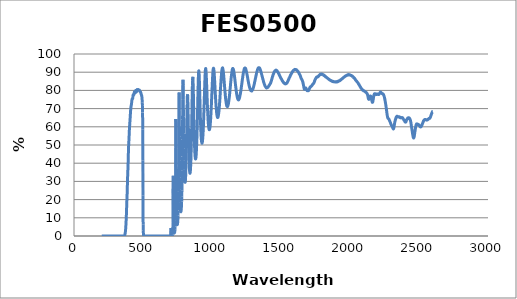
| Category | Series 0 |
|---|---|
| 2600.0 | 68.499 |
| 2599.0 | 68.486 |
| 2598.0 | 68.389 |
| 2597.0 | 68.255 |
| 2596.0 | 68.071 |
| 2595.0 | 67.856 |
| 2594.0 | 67.703 |
| 2593.0 | 67.489 |
| 2592.0 | 67.218 |
| 2591.0 | 67.138 |
| 2590.0 | 66.969 |
| 2589.0 | 66.724 |
| 2588.0 | 66.504 |
| 2587.0 | 66.284 |
| 2586.0 | 66.034 |
| 2585.0 | 65.827 |
| 2584.0 | 65.613 |
| 2583.0 | 65.387 |
| 2582.0 | 65.178 |
| 2581.0 | 65.131 |
| 2580.0 | 64.953 |
| 2579.0 | 64.79 |
| 2578.0 | 64.734 |
| 2577.0 | 64.654 |
| 2576.0 | 64.761 |
| 2575.0 | 64.619 |
| 2574.0 | 64.648 |
| 2573.0 | 64.544 |
| 2572.0 | 64.473 |
| 2571.0 | 64.456 |
| 2570.0 | 64.378 |
| 2569.0 | 64.387 |
| 2568.0 | 64.315 |
| 2567.0 | 64.325 |
| 2566.0 | 64.165 |
| 2565.0 | 64.015 |
| 2564.0 | 64.051 |
| 2563.0 | 63.974 |
| 2562.0 | 64.001 |
| 2561.0 | 63.814 |
| 2560.0 | 63.844 |
| 2559.0 | 63.832 |
| 2558.0 | 63.679 |
| 2557.0 | 63.781 |
| 2556.0 | 63.698 |
| 2555.0 | 63.745 |
| 2554.0 | 63.726 |
| 2553.0 | 63.829 |
| 2552.0 | 63.738 |
| 2551.0 | 63.839 |
| 2550.0 | 63.887 |
| 2549.0 | 63.909 |
| 2548.0 | 63.908 |
| 2547.0 | 63.933 |
| 2546.0 | 64.01 |
| 2545.0 | 63.968 |
| 2544.0 | 63.911 |
| 2543.0 | 63.993 |
| 2542.0 | 64.005 |
| 2541.0 | 63.936 |
| 2540.0 | 63.906 |
| 2539.0 | 63.852 |
| 2538.0 | 63.786 |
| 2537.0 | 63.677 |
| 2536.0 | 63.669 |
| 2535.0 | 63.457 |
| 2534.0 | 63.336 |
| 2533.0 | 63.187 |
| 2532.0 | 63.136 |
| 2531.0 | 62.85 |
| 2530.0 | 62.669 |
| 2529.0 | 62.463 |
| 2528.0 | 62.302 |
| 2527.0 | 62.128 |
| 2526.0 | 61.932 |
| 2525.0 | 61.717 |
| 2524.0 | 61.502 |
| 2523.0 | 61.374 |
| 2522.0 | 61.182 |
| 2521.0 | 60.892 |
| 2520.0 | 60.77 |
| 2519.0 | 60.688 |
| 2518.0 | 60.524 |
| 2517.0 | 60.266 |
| 2516.0 | 60.193 |
| 2515.0 | 60.096 |
| 2514.0 | 60.039 |
| 2513.0 | 59.946 |
| 2512.0 | 59.954 |
| 2511.0 | 59.932 |
| 2510.0 | 60.005 |
| 2509.0 | 60.042 |
| 2508.0 | 60.108 |
| 2507.0 | 60.172 |
| 2506.0 | 60.238 |
| 2505.0 | 60.357 |
| 2504.0 | 60.441 |
| 2503.0 | 60.53 |
| 2502.0 | 60.752 |
| 2501.0 | 60.722 |
| 2500.0 | 60.884 |
| 2499.0 | 61.047 |
| 2498.0 | 61.03 |
| 2497.0 | 61.134 |
| 2496.0 | 61.274 |
| 2495.0 | 61.306 |
| 2494.0 | 61.327 |
| 2493.0 | 61.361 |
| 2492.0 | 61.408 |
| 2491.0 | 61.386 |
| 2490.0 | 61.442 |
| 2489.0 | 61.438 |
| 2488.0 | 61.518 |
| 2487.0 | 61.565 |
| 2486.0 | 61.558 |
| 2485.0 | 61.612 |
| 2484.0 | 61.506 |
| 2483.0 | 61.581 |
| 2482.0 | 61.523 |
| 2481.0 | 61.346 |
| 2480.0 | 61.155 |
| 2479.0 | 60.99 |
| 2478.0 | 60.609 |
| 2477.0 | 60.35 |
| 2476.0 | 60.003 |
| 2475.0 | 59.605 |
| 2474.0 | 59.11 |
| 2473.0 | 58.639 |
| 2472.0 | 58.097 |
| 2471.0 | 57.627 |
| 2470.0 | 57.162 |
| 2469.0 | 56.637 |
| 2468.0 | 56.035 |
| 2467.0 | 55.505 |
| 2466.0 | 55.067 |
| 2465.0 | 54.567 |
| 2464.0 | 54.275 |
| 2463.0 | 54.07 |
| 2462.0 | 53.96 |
| 2461.0 | 53.79 |
| 2460.0 | 53.982 |
| 2459.0 | 54.095 |
| 2458.0 | 54.323 |
| 2457.0 | 54.785 |
| 2456.0 | 55.182 |
| 2455.0 | 55.616 |
| 2454.0 | 55.963 |
| 2453.0 | 56.507 |
| 2452.0 | 56.924 |
| 2451.0 | 57.466 |
| 2450.0 | 57.919 |
| 2449.0 | 58.414 |
| 2448.0 | 58.925 |
| 2447.0 | 59.394 |
| 2446.0 | 59.949 |
| 2445.0 | 60.416 |
| 2444.0 | 61.032 |
| 2443.0 | 61.467 |
| 2442.0 | 61.95 |
| 2441.0 | 62.509 |
| 2440.0 | 62.75 |
| 2439.0 | 63.087 |
| 2438.0 | 63.503 |
| 2437.0 | 63.759 |
| 2436.0 | 63.857 |
| 2435.0 | 64.092 |
| 2434.0 | 64.332 |
| 2433.0 | 64.366 |
| 2432.0 | 64.584 |
| 2431.0 | 64.708 |
| 2430.0 | 64.746 |
| 2429.0 | 64.807 |
| 2428.0 | 64.839 |
| 2427.0 | 64.867 |
| 2426.0 | 64.988 |
| 2425.0 | 64.92 |
| 2424.0 | 64.914 |
| 2423.0 | 64.905 |
| 2422.0 | 64.936 |
| 2421.0 | 64.886 |
| 2420.0 | 64.807 |
| 2419.0 | 64.829 |
| 2418.0 | 64.733 |
| 2417.0 | 64.608 |
| 2416.0 | 64.532 |
| 2415.0 | 64.46 |
| 2414.0 | 64.219 |
| 2413.0 | 64.221 |
| 2412.0 | 64.067 |
| 2411.0 | 63.83 |
| 2410.0 | 63.697 |
| 2409.0 | 63.561 |
| 2408.0 | 63.275 |
| 2407.0 | 63.106 |
| 2406.0 | 62.95 |
| 2405.0 | 62.686 |
| 2404.0 | 62.591 |
| 2403.0 | 62.632 |
| 2402.0 | 62.535 |
| 2401.0 | 62.614 |
| 2400.0 | 62.68 |
| 2399.0 | 62.671 |
| 2398.0 | 62.782 |
| 2397.0 | 62.964 |
| 2396.0 | 63.082 |
| 2395.0 | 63.202 |
| 2394.0 | 63.341 |
| 2393.0 | 63.485 |
| 2392.0 | 63.596 |
| 2391.0 | 63.778 |
| 2390.0 | 63.89 |
| 2389.0 | 63.929 |
| 2388.0 | 64.107 |
| 2387.0 | 64.193 |
| 2386.0 | 64.318 |
| 2385.0 | 64.485 |
| 2384.0 | 64.606 |
| 2383.0 | 64.669 |
| 2382.0 | 64.846 |
| 2381.0 | 64.924 |
| 2380.0 | 64.988 |
| 2379.0 | 65.081 |
| 2378.0 | 65.055 |
| 2377.0 | 65.072 |
| 2376.0 | 65.12 |
| 2375.0 | 65.001 |
| 2374.0 | 64.998 |
| 2373.0 | 65.071 |
| 2372.0 | 65 |
| 2371.0 | 65.001 |
| 2370.0 | 64.878 |
| 2369.0 | 65.002 |
| 2368.0 | 64.956 |
| 2367.0 | 64.913 |
| 2366.0 | 64.986 |
| 2365.0 | 64.933 |
| 2364.0 | 65.103 |
| 2363.0 | 65.094 |
| 2362.0 | 65.146 |
| 2361.0 | 65.318 |
| 2360.0 | 65.36 |
| 2359.0 | 65.426 |
| 2358.0 | 65.432 |
| 2357.0 | 65.517 |
| 2356.0 | 65.537 |
| 2355.0 | 65.526 |
| 2354.0 | 65.425 |
| 2353.0 | 65.49 |
| 2352.0 | 65.42 |
| 2351.0 | 65.335 |
| 2350.0 | 65.427 |
| 2349.0 | 65.487 |
| 2348.0 | 65.428 |
| 2347.0 | 65.553 |
| 2346.0 | 65.524 |
| 2345.0 | 65.612 |
| 2344.0 | 65.661 |
| 2343.0 | 65.72 |
| 2342.0 | 65.731 |
| 2341.0 | 65.836 |
| 2340.0 | 65.79 |
| 2339.0 | 65.692 |
| 2338.0 | 65.629 |
| 2337.0 | 65.575 |
| 2336.0 | 65.455 |
| 2335.0 | 65.29 |
| 2334.0 | 65.168 |
| 2333.0 | 64.843 |
| 2332.0 | 64.634 |
| 2331.0 | 64.416 |
| 2330.0 | 64.099 |
| 2329.0 | 63.827 |
| 2328.0 | 63.649 |
| 2327.0 | 63.3 |
| 2326.0 | 62.936 |
| 2325.0 | 62.686 |
| 2324.0 | 62.281 |
| 2323.0 | 61.818 |
| 2322.0 | 61.443 |
| 2321.0 | 60.929 |
| 2320.0 | 60.406 |
| 2319.0 | 59.988 |
| 2318.0 | 59.506 |
| 2317.0 | 59.191 |
| 2316.0 | 58.978 |
| 2315.0 | 58.849 |
| 2314.0 | 58.801 |
| 2313.0 | 58.95 |
| 2312.0 | 58.981 |
| 2311.0 | 59.197 |
| 2310.0 | 59.374 |
| 2309.0 | 59.648 |
| 2308.0 | 59.865 |
| 2307.0 | 60.021 |
| 2306.0 | 60.198 |
| 2305.0 | 60.302 |
| 2304.0 | 60.451 |
| 2303.0 | 60.477 |
| 2302.0 | 60.641 |
| 2301.0 | 60.79 |
| 2300.0 | 60.906 |
| 2299.0 | 61.033 |
| 2298.0 | 61.269 |
| 2297.0 | 61.377 |
| 2296.0 | 61.622 |
| 2295.0 | 61.84 |
| 2294.0 | 62 |
| 2293.0 | 62.246 |
| 2292.0 | 62.453 |
| 2291.0 | 62.595 |
| 2290.0 | 62.759 |
| 2289.0 | 62.949 |
| 2288.0 | 63.08 |
| 2287.0 | 63.289 |
| 2286.0 | 63.512 |
| 2285.0 | 63.736 |
| 2284.0 | 63.864 |
| 2283.0 | 64.007 |
| 2282.0 | 64.172 |
| 2281.0 | 64.281 |
| 2280.0 | 64.384 |
| 2279.0 | 64.405 |
| 2278.0 | 64.538 |
| 2277.0 | 64.623 |
| 2276.0 | 64.613 |
| 2275.0 | 64.66 |
| 2274.0 | 64.968 |
| 2273.0 | 65.053 |
| 2272.0 | 65.417 |
| 2271.0 | 65.8 |
| 2270.0 | 66.258 |
| 2269.0 | 66.739 |
| 2268.0 | 67.259 |
| 2267.0 | 67.808 |
| 2266.0 | 68.33 |
| 2265.0 | 68.99 |
| 2264.0 | 69.536 |
| 2263.0 | 70.117 |
| 2262.0 | 70.641 |
| 2261.0 | 71.212 |
| 2260.0 | 71.718 |
| 2259.0 | 72.141 |
| 2258.0 | 72.752 |
| 2257.0 | 73.169 |
| 2256.0 | 73.657 |
| 2255.0 | 74.114 |
| 2254.0 | 74.479 |
| 2253.0 | 74.943 |
| 2252.0 | 75.249 |
| 2251.0 | 75.713 |
| 2250.0 | 75.918 |
| 2249.0 | 76.366 |
| 2248.0 | 76.545 |
| 2247.0 | 76.828 |
| 2246.0 | 77.145 |
| 2245.0 | 77.224 |
| 2244.0 | 77.434 |
| 2243.0 | 77.637 |
| 2242.0 | 77.865 |
| 2241.0 | 77.871 |
| 2240.0 | 77.936 |
| 2239.0 | 77.99 |
| 2238.0 | 78.101 |
| 2237.0 | 78.094 |
| 2236.0 | 78.171 |
| 2235.0 | 78.203 |
| 2234.0 | 78.278 |
| 2233.0 | 78.155 |
| 2232.0 | 78.292 |
| 2231.0 | 78.332 |
| 2230.0 | 78.45 |
| 2229.0 | 78.527 |
| 2228.0 | 78.625 |
| 2227.0 | 78.685 |
| 2226.0 | 78.754 |
| 2225.0 | 78.872 |
| 2224.0 | 78.933 |
| 2223.0 | 78.97 |
| 2222.0 | 79.001 |
| 2221.0 | 79.087 |
| 2220.0 | 78.958 |
| 2219.0 | 78.887 |
| 2218.0 | 78.879 |
| 2217.0 | 78.741 |
| 2216.0 | 78.659 |
| 2215.0 | 78.408 |
| 2214.0 | 78.302 |
| 2213.0 | 78.233 |
| 2212.0 | 78.029 |
| 2211.0 | 77.981 |
| 2210.0 | 77.8 |
| 2209.0 | 77.751 |
| 2208.0 | 77.721 |
| 2207.0 | 77.808 |
| 2206.0 | 77.811 |
| 2205.0 | 77.795 |
| 2204.0 | 77.75 |
| 2203.0 | 77.921 |
| 2202.0 | 77.981 |
| 2201.0 | 77.975 |
| 2200.0 | 78.064 |
| 2199.0 | 77.979 |
| 2198.0 | 78.065 |
| 2197.0 | 78.022 |
| 2196.0 | 77.966 |
| 2195.0 | 78.016 |
| 2194.0 | 77.964 |
| 2193.0 | 77.857 |
| 2192.0 | 77.826 |
| 2191.0 | 77.786 |
| 2190.0 | 77.719 |
| 2189.0 | 77.867 |
| 2188.0 | 77.845 |
| 2187.0 | 77.862 |
| 2186.0 | 78.015 |
| 2185.0 | 78.001 |
| 2184.0 | 77.99 |
| 2183.0 | 78.099 |
| 2182.0 | 78.197 |
| 2181.0 | 78.215 |
| 2180.0 | 78.146 |
| 2179.0 | 78.164 |
| 2178.0 | 78.15 |
| 2177.0 | 78.104 |
| 2176.0 | 77.845 |
| 2175.0 | 77.729 |
| 2174.0 | 77.52 |
| 2173.0 | 77.203 |
| 2172.0 | 76.77 |
| 2171.0 | 76.459 |
| 2170.0 | 75.863 |
| 2169.0 | 75.419 |
| 2168.0 | 74.959 |
| 2167.0 | 74.509 |
| 2166.0 | 74.042 |
| 2165.0 | 73.678 |
| 2164.0 | 73.518 |
| 2163.0 | 73.428 |
| 2162.0 | 73.449 |
| 2161.0 | 73.661 |
| 2160.0 | 73.842 |
| 2159.0 | 74.201 |
| 2158.0 | 74.526 |
| 2157.0 | 74.949 |
| 2156.0 | 75.223 |
| 2155.0 | 75.62 |
| 2154.0 | 76.009 |
| 2153.0 | 76.203 |
| 2152.0 | 76.481 |
| 2151.0 | 76.665 |
| 2150.0 | 76.768 |
| 2149.0 | 76.872 |
| 2148.0 | 76.906 |
| 2147.0 | 76.896 |
| 2146.0 | 76.887 |
| 2145.0 | 76.612 |
| 2144.0 | 76.471 |
| 2143.0 | 76.249 |
| 2142.0 | 76.081 |
| 2141.0 | 75.865 |
| 2140.0 | 75.581 |
| 2139.0 | 75.352 |
| 2138.0 | 75.185 |
| 2137.0 | 75.194 |
| 2136.0 | 75.076 |
| 2135.0 | 75.238 |
| 2134.0 | 75.377 |
| 2133.0 | 75.596 |
| 2132.0 | 76.024 |
| 2131.0 | 76.299 |
| 2130.0 | 76.735 |
| 2129.0 | 77.123 |
| 2128.0 | 77.291 |
| 2127.0 | 77.697 |
| 2126.0 | 77.883 |
| 2125.0 | 78.067 |
| 2124.0 | 78.173 |
| 2123.0 | 78.398 |
| 2122.0 | 78.424 |
| 2121.0 | 78.486 |
| 2120.0 | 78.607 |
| 2119.0 | 78.749 |
| 2118.0 | 78.819 |
| 2117.0 | 78.901 |
| 2116.0 | 78.968 |
| 2115.0 | 79.018 |
| 2114.0 | 79.053 |
| 2113.0 | 79.085 |
| 2112.0 | 79.17 |
| 2111.0 | 79.208 |
| 2110.0 | 79.319 |
| 2109.0 | 79.401 |
| 2108.0 | 79.382 |
| 2107.0 | 79.514 |
| 2106.0 | 79.558 |
| 2105.0 | 79.55 |
| 2104.0 | 79.632 |
| 2103.0 | 79.616 |
| 2102.0 | 79.701 |
| 2101.0 | 79.744 |
| 2100.0 | 79.871 |
| 2099.0 | 79.764 |
| 2098.0 | 79.837 |
| 2097.0 | 80.002 |
| 2096.0 | 79.931 |
| 2095.0 | 80 |
| 2094.0 | 80.059 |
| 2093.0 | 80.199 |
| 2092.0 | 80.136 |
| 2091.0 | 80.325 |
| 2090.0 | 80.376 |
| 2089.0 | 80.421 |
| 2088.0 | 80.487 |
| 2087.0 | 80.531 |
| 2086.0 | 80.74 |
| 2085.0 | 80.734 |
| 2084.0 | 80.861 |
| 2083.0 | 80.96 |
| 2082.0 | 81.11 |
| 2081.0 | 81.253 |
| 2080.0 | 81.227 |
| 2079.0 | 81.361 |
| 2078.0 | 81.506 |
| 2077.0 | 81.63 |
| 2076.0 | 81.861 |
| 2075.0 | 81.947 |
| 2074.0 | 81.991 |
| 2073.0 | 82.126 |
| 2072.0 | 82.359 |
| 2071.0 | 82.412 |
| 2070.0 | 82.499 |
| 2069.0 | 82.766 |
| 2068.0 | 82.825 |
| 2067.0 | 82.918 |
| 2066.0 | 83.188 |
| 2065.0 | 83.288 |
| 2064.0 | 83.342 |
| 2063.0 | 83.416 |
| 2062.0 | 83.507 |
| 2061.0 | 83.678 |
| 2060.0 | 83.756 |
| 2059.0 | 83.953 |
| 2058.0 | 84.027 |
| 2057.0 | 84.123 |
| 2056.0 | 84.269 |
| 2055.0 | 84.377 |
| 2054.0 | 84.437 |
| 2053.0 | 84.6 |
| 2052.0 | 84.675 |
| 2051.0 | 84.725 |
| 2050.0 | 84.773 |
| 2049.0 | 84.967 |
| 2048.0 | 85.051 |
| 2047.0 | 85.184 |
| 2046.0 | 85.173 |
| 2045.0 | 85.399 |
| 2044.0 | 85.469 |
| 2043.0 | 85.546 |
| 2042.0 | 85.581 |
| 2041.0 | 85.627 |
| 2040.0 | 85.796 |
| 2039.0 | 85.93 |
| 2038.0 | 86.031 |
| 2037.0 | 86.18 |
| 2036.0 | 86.325 |
| 2035.0 | 86.418 |
| 2034.0 | 86.527 |
| 2033.0 | 86.597 |
| 2032.0 | 86.641 |
| 2031.0 | 86.68 |
| 2030.0 | 86.831 |
| 2029.0 | 86.793 |
| 2028.0 | 86.947 |
| 2027.0 | 87.042 |
| 2026.0 | 87.103 |
| 2025.0 | 87.082 |
| 2024.0 | 87.33 |
| 2023.0 | 87.355 |
| 2022.0 | 87.466 |
| 2021.0 | 87.574 |
| 2020.0 | 87.531 |
| 2019.0 | 87.707 |
| 2018.0 | 87.571 |
| 2017.0 | 87.824 |
| 2016.0 | 87.842 |
| 2015.0 | 87.914 |
| 2014.0 | 87.969 |
| 2013.0 | 87.988 |
| 2012.0 | 88.143 |
| 2011.0 | 88.121 |
| 2010.0 | 88.107 |
| 2009.0 | 88.219 |
| 2008.0 | 88.158 |
| 2007.0 | 88.229 |
| 2006.0 | 88.255 |
| 2005.0 | 88.321 |
| 2004.0 | 88.393 |
| 2003.0 | 88.404 |
| 2002.0 | 88.457 |
| 2001.0 | 88.508 |
| 2000.0 | 88.506 |
| 1999.0 | 88.473 |
| 1998.0 | 88.559 |
| 1997.0 | 88.444 |
| 1996.0 | 88.567 |
| 1995.0 | 88.502 |
| 1994.0 | 88.545 |
| 1993.0 | 88.519 |
| 1992.0 | 88.612 |
| 1991.0 | 88.736 |
| 1990.0 | 88.624 |
| 1989.0 | 88.485 |
| 1988.0 | 88.548 |
| 1987.0 | 88.538 |
| 1986.0 | 88.547 |
| 1985.0 | 88.558 |
| 1984.0 | 88.455 |
| 1983.0 | 88.488 |
| 1982.0 | 88.566 |
| 1981.0 | 88.439 |
| 1980.0 | 88.42 |
| 1979.0 | 88.308 |
| 1978.0 | 88.323 |
| 1977.0 | 88.265 |
| 1976.0 | 88.301 |
| 1975.0 | 88.25 |
| 1974.0 | 88.24 |
| 1973.0 | 88.097 |
| 1972.0 | 88.049 |
| 1971.0 | 88.018 |
| 1970.0 | 88.052 |
| 1969.0 | 88.032 |
| 1968.0 | 87.953 |
| 1967.0 | 87.81 |
| 1966.0 | 87.768 |
| 1965.0 | 87.748 |
| 1964.0 | 87.743 |
| 1963.0 | 87.646 |
| 1962.0 | 87.598 |
| 1961.0 | 87.565 |
| 1960.0 | 87.509 |
| 1959.0 | 87.443 |
| 1958.0 | 87.391 |
| 1957.0 | 87.294 |
| 1956.0 | 87.231 |
| 1955.0 | 87.214 |
| 1954.0 | 87.109 |
| 1953.0 | 87.082 |
| 1952.0 | 87.034 |
| 1951.0 | 86.959 |
| 1950.0 | 86.894 |
| 1949.0 | 86.769 |
| 1948.0 | 86.757 |
| 1947.0 | 86.661 |
| 1946.0 | 86.636 |
| 1945.0 | 86.565 |
| 1944.0 | 86.436 |
| 1943.0 | 86.348 |
| 1942.0 | 86.375 |
| 1941.0 | 86.306 |
| 1940.0 | 86.293 |
| 1939.0 | 86.201 |
| 1938.0 | 86.101 |
| 1937.0 | 86.095 |
| 1936.0 | 85.94 |
| 1935.0 | 85.939 |
| 1934.0 | 85.899 |
| 1933.0 | 85.875 |
| 1932.0 | 85.767 |
| 1931.0 | 85.787 |
| 1930.0 | 85.681 |
| 1929.0 | 85.646 |
| 1928.0 | 85.389 |
| 1927.0 | 85.487 |
| 1926.0 | 85.345 |
| 1925.0 | 85.424 |
| 1924.0 | 85.306 |
| 1923.0 | 85.294 |
| 1922.0 | 85.364 |
| 1921.0 | 85.254 |
| 1920.0 | 85.133 |
| 1919.0 | 85.219 |
| 1918.0 | 85.081 |
| 1917.0 | 85.035 |
| 1916.0 | 85.033 |
| 1915.0 | 85.058 |
| 1914.0 | 84.823 |
| 1913.0 | 85.01 |
| 1912.0 | 84.929 |
| 1911.0 | 84.894 |
| 1910.0 | 84.76 |
| 1909.0 | 84.867 |
| 1908.0 | 84.786 |
| 1907.0 | 84.667 |
| 1906.0 | 84.66 |
| 1905.0 | 84.661 |
| 1904.0 | 84.838 |
| 1903.0 | 84.709 |
| 1902.0 | 84.63 |
| 1901.0 | 84.72 |
| 1900.0 | 84.694 |
| 1899.0 | 84.582 |
| 1898.0 | 84.63 |
| 1897.0 | 84.73 |
| 1896.0 | 84.74 |
| 1895.0 | 84.66 |
| 1894.0 | 84.696 |
| 1893.0 | 84.782 |
| 1892.0 | 84.676 |
| 1891.0 | 84.737 |
| 1890.0 | 84.624 |
| 1889.0 | 84.719 |
| 1888.0 | 84.702 |
| 1887.0 | 84.74 |
| 1886.0 | 84.8 |
| 1885.0 | 84.792 |
| 1884.0 | 84.784 |
| 1883.0 | 84.791 |
| 1882.0 | 84.757 |
| 1881.0 | 84.859 |
| 1880.0 | 84.841 |
| 1879.0 | 84.906 |
| 1878.0 | 84.867 |
| 1877.0 | 84.78 |
| 1876.0 | 84.882 |
| 1875.0 | 84.977 |
| 1874.0 | 84.917 |
| 1873.0 | 84.98 |
| 1872.0 | 85.097 |
| 1871.0 | 84.963 |
| 1870.0 | 85.08 |
| 1869.0 | 85.153 |
| 1868.0 | 85.071 |
| 1867.0 | 85.208 |
| 1866.0 | 85.24 |
| 1865.0 | 85.319 |
| 1864.0 | 85.299 |
| 1863.0 | 85.38 |
| 1862.0 | 85.329 |
| 1861.0 | 85.503 |
| 1860.0 | 85.505 |
| 1859.0 | 85.532 |
| 1858.0 | 85.485 |
| 1857.0 | 85.591 |
| 1856.0 | 85.677 |
| 1855.0 | 85.711 |
| 1854.0 | 85.748 |
| 1853.0 | 85.75 |
| 1852.0 | 85.878 |
| 1851.0 | 85.849 |
| 1850.0 | 85.91 |
| 1849.0 | 85.951 |
| 1848.0 | 86.086 |
| 1847.0 | 86.125 |
| 1846.0 | 86.149 |
| 1845.0 | 86.119 |
| 1844.0 | 86.244 |
| 1843.0 | 86.365 |
| 1842.0 | 86.372 |
| 1841.0 | 86.498 |
| 1840.0 | 86.552 |
| 1839.0 | 86.583 |
| 1838.0 | 86.64 |
| 1837.0 | 86.699 |
| 1836.0 | 86.781 |
| 1835.0 | 86.883 |
| 1834.0 | 86.908 |
| 1833.0 | 86.931 |
| 1832.0 | 86.954 |
| 1831.0 | 87.107 |
| 1830.0 | 87.127 |
| 1829.0 | 87.178 |
| 1828.0 | 87.235 |
| 1827.0 | 87.344 |
| 1826.0 | 87.43 |
| 1825.0 | 87.484 |
| 1824.0 | 87.479 |
| 1823.0 | 87.48 |
| 1822.0 | 87.731 |
| 1821.0 | 87.686 |
| 1820.0 | 87.739 |
| 1819.0 | 87.771 |
| 1818.0 | 87.915 |
| 1817.0 | 87.883 |
| 1816.0 | 88.083 |
| 1815.0 | 88.063 |
| 1814.0 | 88.152 |
| 1813.0 | 88.158 |
| 1812.0 | 88.172 |
| 1811.0 | 88.354 |
| 1810.0 | 88.411 |
| 1809.0 | 88.487 |
| 1808.0 | 88.535 |
| 1807.0 | 88.526 |
| 1806.0 | 88.58 |
| 1805.0 | 88.487 |
| 1804.0 | 88.595 |
| 1803.0 | 88.682 |
| 1802.0 | 88.622 |
| 1801.0 | 88.82 |
| 1800.0 | 88.798 |
| 1799.0 | 88.857 |
| 1798.0 | 88.796 |
| 1797.0 | 88.847 |
| 1796.0 | 88.826 |
| 1795.0 | 88.935 |
| 1794.0 | 89.015 |
| 1793.0 | 88.891 |
| 1792.0 | 88.898 |
| 1791.0 | 88.789 |
| 1790.0 | 88.827 |
| 1789.0 | 88.899 |
| 1788.0 | 88.876 |
| 1787.0 | 88.813 |
| 1786.0 | 88.965 |
| 1785.0 | 88.835 |
| 1784.0 | 88.867 |
| 1783.0 | 88.805 |
| 1782.0 | 88.573 |
| 1781.0 | 88.589 |
| 1780.0 | 88.54 |
| 1779.0 | 88.414 |
| 1778.0 | 88.392 |
| 1777.0 | 88.311 |
| 1776.0 | 88.298 |
| 1775.0 | 88.128 |
| 1774.0 | 88.019 |
| 1773.0 | 87.943 |
| 1772.0 | 87.733 |
| 1771.0 | 87.868 |
| 1770.0 | 87.614 |
| 1769.0 | 87.707 |
| 1768.0 | 87.557 |
| 1767.0 | 87.486 |
| 1766.0 | 87.475 |
| 1765.0 | 87.557 |
| 1764.0 | 87.354 |
| 1763.0 | 87.349 |
| 1762.0 | 87.315 |
| 1761.0 | 87.375 |
| 1760.0 | 87.171 |
| 1759.0 | 87.36 |
| 1758.0 | 87.209 |
| 1757.0 | 87.219 |
| 1756.0 | 87.174 |
| 1755.0 | 86.908 |
| 1754.0 | 86.856 |
| 1753.0 | 86.713 |
| 1752.0 | 86.605 |
| 1751.0 | 86.461 |
| 1750.0 | 86.319 |
| 1749.0 | 86.13 |
| 1748.0 | 85.947 |
| 1747.0 | 85.954 |
| 1746.0 | 85.714 |
| 1745.0 | 85.408 |
| 1744.0 | 85.243 |
| 1743.0 | 85.137 |
| 1742.0 | 84.748 |
| 1741.0 | 84.623 |
| 1740.0 | 84.401 |
| 1739.0 | 84.179 |
| 1738.0 | 84.038 |
| 1737.0 | 83.975 |
| 1736.0 | 83.822 |
| 1735.0 | 83.663 |
| 1734.0 | 83.665 |
| 1733.0 | 83.592 |
| 1732.0 | 83.499 |
| 1731.0 | 83.374 |
| 1730.0 | 83.325 |
| 1729.0 | 83.258 |
| 1728.0 | 83.193 |
| 1727.0 | 83.011 |
| 1726.0 | 82.941 |
| 1725.0 | 82.841 |
| 1724.0 | 82.73 |
| 1723.0 | 82.551 |
| 1722.0 | 82.491 |
| 1721.0 | 82.396 |
| 1720.0 | 82.362 |
| 1719.0 | 82.244 |
| 1718.0 | 82.226 |
| 1717.0 | 82.167 |
| 1716.0 | 82.048 |
| 1715.0 | 82.006 |
| 1714.0 | 81.98 |
| 1713.0 | 82.015 |
| 1712.0 | 81.93 |
| 1711.0 | 81.611 |
| 1710.0 | 81.686 |
| 1709.0 | 81.464 |
| 1708.0 | 81.373 |
| 1707.0 | 81.157 |
| 1706.0 | 80.915 |
| 1705.0 | 80.754 |
| 1704.0 | 80.682 |
| 1703.0 | 80.372 |
| 1702.0 | 80.277 |
| 1701.0 | 80.031 |
| 1700.0 | 79.907 |
| 1699.0 | 79.912 |
| 1698.0 | 79.826 |
| 1697.0 | 79.922 |
| 1696.0 | 80.059 |
| 1695.0 | 79.986 |
| 1694.0 | 80.214 |
| 1693.0 | 80.037 |
| 1692.0 | 80.021 |
| 1691.0 | 79.986 |
| 1690.0 | 79.833 |
| 1689.0 | 79.947 |
| 1688.0 | 79.999 |
| 1687.0 | 80.062 |
| 1686.0 | 80.241 |
| 1685.0 | 80.386 |
| 1684.0 | 80.613 |
| 1683.0 | 80.744 |
| 1682.0 | 81.055 |
| 1681.0 | 81.172 |
| 1680.0 | 81.204 |
| 1679.0 | 81.339 |
| 1678.0 | 81.129 |
| 1677.0 | 81.033 |
| 1676.0 | 81.025 |
| 1675.0 | 80.96 |
| 1674.0 | 80.847 |
| 1673.0 | 80.716 |
| 1672.0 | 80.637 |
| 1671.0 | 80.574 |
| 1670.0 | 80.653 |
| 1669.0 | 80.702 |
| 1668.0 | 81.015 |
| 1667.0 | 81.281 |
| 1666.0 | 81.688 |
| 1665.0 | 82.001 |
| 1664.0 | 82.433 |
| 1663.0 | 82.863 |
| 1662.0 | 83.263 |
| 1661.0 | 83.671 |
| 1660.0 | 83.908 |
| 1659.0 | 84.345 |
| 1658.0 | 84.556 |
| 1657.0 | 84.927 |
| 1656.0 | 85.035 |
| 1655.0 | 85.324 |
| 1654.0 | 85.591 |
| 1653.0 | 85.562 |
| 1652.0 | 85.773 |
| 1651.0 | 85.905 |
| 1650.0 | 86.102 |
| 1649.0 | 86.237 |
| 1648.0 | 86.346 |
| 1647.0 | 86.463 |
| 1646.0 | 86.604 |
| 1645.0 | 86.937 |
| 1644.0 | 87.103 |
| 1643.0 | 87.397 |
| 1642.0 | 87.598 |
| 1641.0 | 87.626 |
| 1640.0 | 87.933 |
| 1639.0 | 88.216 |
| 1638.0 | 88.387 |
| 1637.0 | 88.486 |
| 1636.0 | 88.606 |
| 1635.0 | 88.793 |
| 1634.0 | 88.845 |
| 1633.0 | 88.975 |
| 1632.0 | 89.193 |
| 1631.0 | 89.362 |
| 1630.0 | 89.529 |
| 1629.0 | 89.71 |
| 1628.0 | 89.827 |
| 1627.0 | 89.785 |
| 1626.0 | 89.945 |
| 1625.0 | 90.206 |
| 1624.0 | 90.308 |
| 1623.0 | 90.287 |
| 1622.0 | 90.392 |
| 1621.0 | 90.596 |
| 1620.0 | 90.626 |
| 1619.0 | 90.691 |
| 1618.0 | 90.802 |
| 1617.0 | 90.933 |
| 1616.0 | 90.991 |
| 1615.0 | 91.047 |
| 1614.0 | 91.11 |
| 1613.0 | 91.293 |
| 1612.0 | 91.259 |
| 1611.0 | 91.262 |
| 1610.0 | 91.359 |
| 1609.0 | 91.345 |
| 1608.0 | 91.357 |
| 1607.0 | 91.371 |
| 1606.0 | 91.467 |
| 1605.0 | 91.495 |
| 1604.0 | 91.524 |
| 1603.0 | 91.518 |
| 1602.0 | 91.373 |
| 1601.0 | 91.523 |
| 1600.0 | 91.481 |
| 1599.0 | 91.487 |
| 1598.0 | 91.415 |
| 1597.0 | 91.369 |
| 1596.0 | 91.209 |
| 1595.0 | 91.324 |
| 1594.0 | 91.22 |
| 1593.0 | 91.136 |
| 1592.0 | 91.122 |
| 1591.0 | 91.076 |
| 1590.0 | 90.924 |
| 1589.0 | 90.875 |
| 1588.0 | 90.83 |
| 1587.0 | 90.616 |
| 1586.0 | 90.573 |
| 1585.0 | 90.514 |
| 1584.0 | 90.258 |
| 1583.0 | 90.157 |
| 1582.0 | 90.215 |
| 1581.0 | 90.131 |
| 1580.0 | 89.803 |
| 1579.0 | 89.794 |
| 1578.0 | 89.714 |
| 1577.0 | 89.498 |
| 1576.0 | 89.294 |
| 1575.0 | 89.207 |
| 1574.0 | 89.033 |
| 1573.0 | 88.911 |
| 1572.0 | 88.737 |
| 1571.0 | 88.643 |
| 1570.0 | 88.533 |
| 1569.0 | 88.371 |
| 1568.0 | 88.26 |
| 1567.0 | 87.974 |
| 1566.0 | 87.875 |
| 1565.0 | 87.733 |
| 1564.0 | 87.492 |
| 1563.0 | 87.259 |
| 1562.0 | 87.192 |
| 1561.0 | 87.071 |
| 1560.0 | 86.892 |
| 1559.0 | 86.682 |
| 1558.0 | 86.479 |
| 1557.0 | 86.471 |
| 1556.0 | 86.177 |
| 1555.0 | 85.951 |
| 1554.0 | 85.877 |
| 1553.0 | 85.64 |
| 1552.0 | 85.442 |
| 1551.0 | 85.271 |
| 1550.0 | 85.123 |
| 1549.0 | 85.041 |
| 1548.0 | 84.82 |
| 1547.0 | 84.601 |
| 1546.0 | 84.369 |
| 1545.0 | 84.347 |
| 1544.0 | 84.177 |
| 1543.0 | 84.153 |
| 1542.0 | 83.995 |
| 1541.0 | 83.905 |
| 1540.0 | 83.865 |
| 1539.0 | 83.839 |
| 1538.0 | 83.754 |
| 1537.0 | 83.806 |
| 1536.0 | 83.713 |
| 1535.0 | 83.711 |
| 1534.0 | 83.578 |
| 1533.0 | 83.611 |
| 1532.0 | 83.632 |
| 1531.0 | 83.75 |
| 1530.0 | 83.756 |
| 1529.0 | 83.667 |
| 1528.0 | 83.68 |
| 1527.0 | 83.821 |
| 1526.0 | 83.853 |
| 1525.0 | 83.828 |
| 1524.0 | 83.918 |
| 1523.0 | 83.916 |
| 1522.0 | 84.011 |
| 1521.0 | 84.201 |
| 1520.0 | 84.17 |
| 1519.0 | 84.293 |
| 1518.0 | 84.437 |
| 1517.0 | 84.43 |
| 1516.0 | 84.59 |
| 1515.0 | 84.712 |
| 1514.0 | 84.843 |
| 1513.0 | 84.888 |
| 1512.0 | 85.029 |
| 1511.0 | 85.146 |
| 1510.0 | 85.246 |
| 1509.0 | 85.415 |
| 1508.0 | 85.457 |
| 1507.0 | 85.641 |
| 1506.0 | 85.864 |
| 1505.0 | 85.92 |
| 1504.0 | 86.065 |
| 1503.0 | 86.264 |
| 1502.0 | 86.349 |
| 1501.0 | 86.434 |
| 1500.0 | 86.617 |
| 1499.0 | 86.816 |
| 1498.0 | 86.834 |
| 1497.0 | 87.016 |
| 1496.0 | 87.109 |
| 1495.0 | 87.366 |
| 1494.0 | 87.589 |
| 1493.0 | 87.62 |
| 1492.0 | 87.849 |
| 1491.0 | 88.023 |
| 1490.0 | 88.145 |
| 1489.0 | 88.386 |
| 1488.0 | 88.42 |
| 1487.0 | 88.662 |
| 1486.0 | 88.945 |
| 1485.0 | 88.916 |
| 1484.0 | 89.151 |
| 1483.0 | 89.293 |
| 1482.0 | 89.52 |
| 1481.0 | 89.458 |
| 1480.0 | 89.782 |
| 1479.0 | 89.777 |
| 1478.0 | 89.928 |
| 1477.0 | 90.005 |
| 1476.0 | 90.247 |
| 1475.0 | 90.222 |
| 1474.0 | 90.344 |
| 1473.0 | 90.511 |
| 1472.0 | 90.555 |
| 1471.0 | 90.797 |
| 1470.0 | 90.809 |
| 1469.0 | 90.868 |
| 1468.0 | 90.898 |
| 1467.0 | 90.85 |
| 1466.0 | 90.985 |
| 1465.0 | 91.019 |
| 1464.0 | 91.161 |
| 1463.0 | 90.999 |
| 1462.0 | 91 |
| 1461.0 | 91.038 |
| 1460.0 | 90.814 |
| 1459.0 | 90.794 |
| 1458.0 | 90.771 |
| 1457.0 | 90.801 |
| 1456.0 | 90.709 |
| 1455.0 | 90.515 |
| 1454.0 | 90.503 |
| 1453.0 | 90.405 |
| 1452.0 | 90.278 |
| 1451.0 | 90.085 |
| 1450.0 | 90.016 |
| 1449.0 | 89.677 |
| 1448.0 | 89.535 |
| 1447.0 | 89.334 |
| 1446.0 | 89.219 |
| 1445.0 | 88.976 |
| 1444.0 | 88.786 |
| 1443.0 | 88.58 |
| 1442.0 | 88.329 |
| 1441.0 | 88.231 |
| 1440.0 | 87.823 |
| 1439.0 | 87.611 |
| 1438.0 | 87.449 |
| 1437.0 | 87.133 |
| 1436.0 | 86.887 |
| 1435.0 | 86.578 |
| 1434.0 | 86.321 |
| 1433.0 | 86.094 |
| 1432.0 | 85.877 |
| 1431.0 | 85.462 |
| 1430.0 | 85.231 |
| 1429.0 | 85.07 |
| 1428.0 | 84.774 |
| 1427.0 | 84.616 |
| 1426.0 | 84.411 |
| 1425.0 | 84.063 |
| 1424.0 | 83.932 |
| 1423.0 | 83.842 |
| 1422.0 | 83.674 |
| 1421.0 | 83.551 |
| 1420.0 | 83.425 |
| 1419.0 | 83.316 |
| 1418.0 | 83.153 |
| 1417.0 | 83.073 |
| 1416.0 | 82.863 |
| 1415.0 | 82.786 |
| 1414.0 | 82.744 |
| 1413.0 | 82.557 |
| 1412.0 | 82.426 |
| 1411.0 | 82.374 |
| 1410.0 | 82.222 |
| 1409.0 | 82.176 |
| 1408.0 | 82.087 |
| 1407.0 | 81.985 |
| 1406.0 | 81.762 |
| 1405.0 | 81.741 |
| 1404.0 | 81.764 |
| 1403.0 | 81.673 |
| 1402.0 | 81.536 |
| 1401.0 | 81.584 |
| 1400.0 | 81.472 |
| 1399.0 | 81.414 |
| 1398.0 | 81.412 |
| 1397.0 | 81.352 |
| 1396.0 | 81.397 |
| 1395.0 | 81.413 |
| 1394.0 | 81.371 |
| 1393.0 | 81.496 |
| 1392.0 | 81.545 |
| 1391.0 | 81.645 |
| 1390.0 | 81.783 |
| 1389.0 | 81.878 |
| 1388.0 | 81.92 |
| 1387.0 | 82.13 |
| 1386.0 | 82.266 |
| 1385.0 | 82.363 |
| 1384.0 | 82.429 |
| 1383.0 | 82.698 |
| 1382.0 | 82.943 |
| 1381.0 | 83.106 |
| 1380.0 | 83.288 |
| 1379.0 | 83.508 |
| 1378.0 | 83.707 |
| 1377.0 | 84.014 |
| 1376.0 | 84.135 |
| 1375.0 | 84.418 |
| 1374.0 | 84.639 |
| 1373.0 | 85.001 |
| 1372.0 | 85.221 |
| 1371.0 | 85.629 |
| 1370.0 | 85.896 |
| 1369.0 | 86.127 |
| 1368.0 | 86.328 |
| 1367.0 | 86.713 |
| 1366.0 | 86.967 |
| 1365.0 | 87.33 |
| 1364.0 | 87.559 |
| 1363.0 | 87.813 |
| 1362.0 | 88.193 |
| 1361.0 | 88.505 |
| 1360.0 | 88.704 |
| 1359.0 | 89.054 |
| 1358.0 | 89.301 |
| 1357.0 | 89.586 |
| 1356.0 | 89.907 |
| 1355.0 | 90.192 |
| 1354.0 | 90.437 |
| 1353.0 | 90.653 |
| 1352.0 | 90.889 |
| 1351.0 | 91.142 |
| 1350.0 | 91.387 |
| 1349.0 | 91.62 |
| 1348.0 | 91.865 |
| 1347.0 | 91.973 |
| 1346.0 | 92.138 |
| 1345.0 | 92.199 |
| 1344.0 | 92.281 |
| 1343.0 | 92.403 |
| 1342.0 | 92.402 |
| 1341.0 | 92.448 |
| 1340.0 | 92.455 |
| 1339.0 | 92.431 |
| 1338.0 | 92.414 |
| 1337.0 | 92.319 |
| 1336.0 | 92.395 |
| 1335.0 | 92.149 |
| 1334.0 | 91.986 |
| 1333.0 | 92.054 |
| 1332.0 | 91.803 |
| 1331.0 | 91.519 |
| 1330.0 | 91.5 |
| 1329.0 | 91.172 |
| 1328.0 | 90.778 |
| 1327.0 | 90.601 |
| 1326.0 | 90.181 |
| 1325.0 | 90.067 |
| 1324.0 | 89.818 |
| 1323.0 | 89.451 |
| 1322.0 | 89.074 |
| 1321.0 | 88.776 |
| 1320.0 | 88.409 |
| 1319.0 | 88.077 |
| 1318.0 | 87.792 |
| 1317.0 | 87.292 |
| 1316.0 | 86.968 |
| 1315.0 | 86.632 |
| 1314.0 | 86.336 |
| 1313.0 | 85.851 |
| 1312.0 | 85.578 |
| 1311.0 | 85.109 |
| 1310.0 | 84.83 |
| 1309.0 | 84.561 |
| 1308.0 | 84.137 |
| 1307.0 | 83.707 |
| 1306.0 | 83.428 |
| 1305.0 | 83.109 |
| 1304.0 | 82.778 |
| 1303.0 | 82.459 |
| 1302.0 | 82.209 |
| 1301.0 | 81.896 |
| 1300.0 | 81.583 |
| 1299.0 | 81.465 |
| 1298.0 | 81.179 |
| 1297.0 | 80.845 |
| 1296.0 | 80.714 |
| 1295.0 | 80.54 |
| 1294.0 | 80.475 |
| 1293.0 | 80.226 |
| 1292.0 | 80.182 |
| 1291.0 | 80.015 |
| 1290.0 | 79.891 |
| 1289.0 | 79.893 |
| 1288.0 | 79.681 |
| 1287.0 | 79.694 |
| 1286.0 | 79.716 |
| 1285.0 | 79.742 |
| 1284.0 | 79.832 |
| 1283.0 | 79.861 |
| 1282.0 | 79.809 |
| 1281.0 | 79.905 |
| 1280.0 | 80.025 |
| 1279.0 | 80.168 |
| 1278.0 | 80.413 |
| 1277.0 | 80.525 |
| 1276.0 | 80.814 |
| 1275.0 | 81.014 |
| 1274.0 | 81.245 |
| 1273.0 | 81.459 |
| 1272.0 | 81.82 |
| 1271.0 | 82.069 |
| 1270.0 | 82.332 |
| 1269.0 | 82.681 |
| 1268.0 | 82.951 |
| 1267.0 | 83.369 |
| 1266.0 | 83.68 |
| 1265.0 | 84.109 |
| 1264.0 | 84.564 |
| 1263.0 | 84.989 |
| 1262.0 | 85.317 |
| 1261.0 | 85.78 |
| 1260.0 | 86.068 |
| 1259.0 | 86.596 |
| 1258.0 | 87.078 |
| 1257.0 | 87.452 |
| 1256.0 | 87.786 |
| 1255.0 | 88.326 |
| 1254.0 | 88.651 |
| 1253.0 | 89.028 |
| 1252.0 | 89.473 |
| 1251.0 | 89.78 |
| 1250.0 | 90.17 |
| 1249.0 | 90.461 |
| 1248.0 | 90.794 |
| 1247.0 | 90.956 |
| 1246.0 | 91.348 |
| 1245.0 | 91.602 |
| 1244.0 | 91.936 |
| 1243.0 | 92.1 |
| 1242.0 | 92.096 |
| 1241.0 | 92.254 |
| 1240.0 | 92.275 |
| 1239.0 | 92.377 |
| 1238.0 | 92.283 |
| 1237.0 | 92.246 |
| 1236.0 | 92.176 |
| 1235.0 | 91.923 |
| 1234.0 | 91.882 |
| 1233.0 | 91.618 |
| 1232.0 | 91.302 |
| 1231.0 | 90.86 |
| 1230.0 | 90.603 |
| 1229.0 | 90.243 |
| 1228.0 | 89.92 |
| 1227.0 | 89.475 |
| 1226.0 | 89.053 |
| 1225.0 | 88.456 |
| 1224.0 | 88.058 |
| 1223.0 | 87.569 |
| 1222.0 | 86.961 |
| 1221.0 | 86.482 |
| 1220.0 | 85.986 |
| 1219.0 | 85.319 |
| 1218.0 | 84.826 |
| 1217.0 | 84.212 |
| 1216.0 | 83.575 |
| 1215.0 | 83.048 |
| 1214.0 | 82.565 |
| 1213.0 | 81.986 |
| 1212.0 | 81.33 |
| 1211.0 | 80.85 |
| 1210.0 | 80.223 |
| 1209.0 | 79.827 |
| 1208.0 | 79.397 |
| 1207.0 | 78.778 |
| 1206.0 | 78.429 |
| 1205.0 | 77.887 |
| 1204.0 | 77.567 |
| 1203.0 | 77.226 |
| 1202.0 | 76.816 |
| 1201.0 | 76.62 |
| 1200.0 | 76.128 |
| 1199.0 | 75.903 |
| 1198.0 | 75.573 |
| 1197.0 | 75.325 |
| 1196.0 | 75.236 |
| 1195.0 | 75.048 |
| 1194.0 | 74.939 |
| 1193.0 | 74.78 |
| 1192.0 | 74.806 |
| 1191.0 | 74.814 |
| 1190.0 | 74.814 |
| 1189.0 | 74.946 |
| 1188.0 | 75.158 |
| 1187.0 | 75.287 |
| 1186.0 | 75.506 |
| 1185.0 | 75.765 |
| 1184.0 | 76.023 |
| 1183.0 | 76.356 |
| 1182.0 | 76.77 |
| 1181.0 | 77.154 |
| 1180.0 | 77.59 |
| 1179.0 | 77.963 |
| 1178.0 | 78.501 |
| 1177.0 | 79.047 |
| 1176.0 | 79.597 |
| 1175.0 | 80.135 |
| 1174.0 | 80.784 |
| 1173.0 | 81.354 |
| 1172.0 | 81.974 |
| 1171.0 | 82.639 |
| 1170.0 | 83.266 |
| 1169.0 | 83.942 |
| 1168.0 | 84.558 |
| 1167.0 | 85.268 |
| 1166.0 | 85.904 |
| 1165.0 | 86.55 |
| 1164.0 | 87.196 |
| 1163.0 | 87.724 |
| 1162.0 | 88.341 |
| 1161.0 | 88.951 |
| 1160.0 | 89.523 |
| 1159.0 | 90.022 |
| 1158.0 | 90.444 |
| 1157.0 | 90.818 |
| 1156.0 | 91.085 |
| 1155.0 | 91.513 |
| 1154.0 | 91.686 |
| 1153.0 | 91.816 |
| 1152.0 | 91.907 |
| 1151.0 | 92.068 |
| 1150.0 | 91.964 |
| 1149.0 | 91.956 |
| 1148.0 | 91.72 |
| 1147.0 | 91.493 |
| 1146.0 | 90.967 |
| 1145.0 | 90.51 |
| 1144.0 | 90.119 |
| 1143.0 | 89.558 |
| 1142.0 | 88.857 |
| 1141.0 | 88.238 |
| 1140.0 | 87.594 |
| 1139.0 | 86.96 |
| 1138.0 | 86.2 |
| 1137.0 | 85.394 |
| 1136.0 | 84.665 |
| 1135.0 | 83.902 |
| 1134.0 | 82.972 |
| 1133.0 | 82.168 |
| 1132.0 | 81.328 |
| 1131.0 | 80.665 |
| 1130.0 | 79.86 |
| 1129.0 | 79.047 |
| 1128.0 | 78.206 |
| 1127.0 | 77.475 |
| 1126.0 | 76.812 |
| 1125.0 | 76.113 |
| 1124.0 | 75.499 |
| 1123.0 | 74.935 |
| 1122.0 | 74.264 |
| 1121.0 | 73.739 |
| 1120.0 | 73.272 |
| 1119.0 | 72.754 |
| 1118.0 | 72.406 |
| 1117.0 | 72.059 |
| 1116.0 | 71.747 |
| 1115.0 | 71.462 |
| 1114.0 | 71.328 |
| 1113.0 | 71.19 |
| 1112.0 | 71.105 |
| 1111.0 | 71.074 |
| 1110.0 | 71.141 |
| 1109.0 | 71.241 |
| 1108.0 | 71.356 |
| 1107.0 | 71.51 |
| 1106.0 | 71.853 |
| 1105.0 | 72.242 |
| 1104.0 | 72.554 |
| 1103.0 | 73.017 |
| 1102.0 | 73.59 |
| 1101.0 | 74.087 |
| 1100.0 | 74.661 |
| 1099.0 | 75.321 |
| 1098.0 | 76.059 |
| 1097.0 | 76.784 |
| 1096.0 | 77.636 |
| 1095.0 | 78.604 |
| 1094.0 | 79.314 |
| 1093.0 | 80.26 |
| 1092.0 | 81.266 |
| 1091.0 | 82.255 |
| 1090.0 | 83.223 |
| 1089.0 | 84.25 |
| 1088.0 | 85.195 |
| 1087.0 | 86.046 |
| 1086.0 | 87.011 |
| 1085.0 | 88.027 |
| 1084.0 | 88.798 |
| 1083.0 | 89.541 |
| 1082.0 | 90.293 |
| 1081.0 | 90.858 |
| 1080.0 | 91.303 |
| 1079.0 | 91.758 |
| 1078.0 | 92.103 |
| 1077.0 | 92.412 |
| 1076.0 | 92.332 |
| 1075.0 | 92.291 |
| 1074.0 | 92.069 |
| 1073.0 | 91.709 |
| 1072.0 | 91.271 |
| 1071.0 | 90.623 |
| 1070.0 | 89.952 |
| 1069.0 | 89.205 |
| 1068.0 | 88.116 |
| 1067.0 | 87.186 |
| 1066.0 | 86.27 |
| 1065.0 | 84.965 |
| 1064.0 | 83.748 |
| 1063.0 | 82.558 |
| 1062.0 | 81.398 |
| 1061.0 | 80.046 |
| 1060.0 | 78.743 |
| 1059.0 | 77.611 |
| 1058.0 | 76.299 |
| 1057.0 | 75.1 |
| 1056.0 | 74.043 |
| 1055.0 | 72.962 |
| 1054.0 | 71.875 |
| 1053.0 | 70.983 |
| 1052.0 | 69.98 |
| 1051.0 | 69.178 |
| 1050.0 | 68.431 |
| 1049.0 | 67.7 |
| 1048.0 | 67.15 |
| 1047.0 | 66.66 |
| 1046.0 | 66.141 |
| 1045.0 | 65.743 |
| 1044.0 | 65.454 |
| 1043.0 | 65.238 |
| 1042.0 | 65.163 |
| 1041.0 | 65.125 |
| 1040.0 | 65.137 |
| 1039.0 | 65.327 |
| 1038.0 | 65.642 |
| 1037.0 | 65.911 |
| 1036.0 | 66.328 |
| 1035.0 | 66.865 |
| 1034.0 | 67.399 |
| 1033.0 | 68.16 |
| 1032.0 | 68.961 |
| 1031.0 | 69.863 |
| 1030.0 | 70.821 |
| 1029.0 | 71.891 |
| 1028.0 | 73.028 |
| 1027.0 | 74.205 |
| 1026.0 | 75.591 |
| 1025.0 | 76.829 |
| 1024.0 | 78.314 |
| 1023.0 | 79.67 |
| 1022.0 | 81.179 |
| 1021.0 | 82.612 |
| 1020.0 | 84.054 |
| 1019.0 | 85.514 |
| 1018.0 | 86.784 |
| 1017.0 | 88.081 |
| 1016.0 | 89.205 |
| 1015.0 | 90.266 |
| 1014.0 | 90.904 |
| 1013.0 | 91.508 |
| 1012.0 | 91.948 |
| 1011.0 | 92.162 |
| 1010.0 | 92.098 |
| 1009.0 | 91.691 |
| 1008.0 | 91.284 |
| 1007.0 | 90.344 |
| 1006.0 | 89.171 |
| 1005.0 | 88.192 |
| 1004.0 | 86.635 |
| 1003.0 | 84.965 |
| 1002.0 | 83.545 |
| 1001.0 | 81.728 |
| 1000.0 | 79.905 |
| 999.0 | 78.118 |
| 998.0 | 76.428 |
| 997.0 | 74.646 |
| 996.0 | 72.888 |
| 995.0 | 71.15 |
| 994.0 | 69.592 |
| 993.0 | 68.026 |
| 992.0 | 66.666 |
| 991.0 | 65.338 |
| 990.0 | 64.066 |
| 989.0 | 63.087 |
| 988.0 | 61.947 |
| 987.0 | 61.086 |
| 986.0 | 60.373 |
| 985.0 | 59.759 |
| 984.0 | 59.163 |
| 983.0 | 58.749 |
| 982.0 | 58.472 |
| 981.0 | 58.442 |
| 980.0 | 58.399 |
| 979.0 | 58.519 |
| 978.0 | 58.816 |
| 977.0 | 59.265 |
| 976.0 | 59.768 |
| 975.0 | 60.515 |
| 974.0 | 61.305 |
| 973.0 | 62.268 |
| 972.0 | 63.339 |
| 971.0 | 64.637 |
| 970.0 | 66.109 |
| 969.0 | 67.634 |
| 968.0 | 69.38 |
| 967.0 | 71.12 |
| 966.0 | 73.108 |
| 965.0 | 74.997 |
| 964.0 | 77.091 |
| 963.0 | 79.258 |
| 962.0 | 81.464 |
| 961.0 | 83.397 |
| 960.0 | 85.404 |
| 959.0 | 87.279 |
| 958.0 | 88.799 |
| 957.0 | 90.114 |
| 956.0 | 91.043 |
| 955.0 | 91.874 |
| 954.0 | 92.017 |
| 953.0 | 91.687 |
| 952.0 | 91.096 |
| 951.0 | 90.028 |
| 950.0 | 88.463 |
| 949.0 | 86.662 |
| 948.0 | 84.696 |
| 947.0 | 82.47 |
| 946.0 | 79.954 |
| 945.0 | 77.413 |
| 944.0 | 74.859 |
| 943.0 | 72.31 |
| 942.0 | 69.898 |
| 941.0 | 67.424 |
| 940.0 | 65.166 |
| 939.0 | 63.079 |
| 938.0 | 61.094 |
| 937.0 | 59.242 |
| 936.0 | 57.636 |
| 935.0 | 56.216 |
| 934.0 | 54.978 |
| 933.0 | 53.845 |
| 932.0 | 52.899 |
| 931.0 | 52.172 |
| 930.0 | 51.597 |
| 929.0 | 51.25 |
| 928.0 | 51.008 |
| 927.0 | 51.033 |
| 926.0 | 51.213 |
| 925.0 | 51.57 |
| 924.0 | 52.18 |
| 923.0 | 52.848 |
| 922.0 | 53.874 |
| 921.0 | 55.013 |
| 920.0 | 56.365 |
| 919.0 | 58.069 |
| 918.0 | 59.936 |
| 917.0 | 62.091 |
| 916.0 | 64.395 |
| 915.0 | 66.92 |
| 914.0 | 69.597 |
| 913.0 | 72.44 |
| 912.0 | 75.562 |
| 911.0 | 78.464 |
| 910.0 | 81.33 |
| 909.0 | 83.991 |
| 908.0 | 86.421 |
| 907.0 | 88.357 |
| 906.0 | 89.759 |
| 905.0 | 90.621 |
| 904.0 | 90.673 |
| 903.0 | 89.949 |
| 902.0 | 88.661 |
| 901.0 | 86.635 |
| 900.0 | 84.041 |
| 899.0 | 80.945 |
| 898.0 | 77.593 |
| 897.0 | 74.167 |
| 896.0 | 70.524 |
| 895.0 | 67.092 |
| 894.0 | 63.725 |
| 893.0 | 60.529 |
| 892.0 | 57.575 |
| 891.0 | 54.915 |
| 890.0 | 52.488 |
| 889.0 | 50.316 |
| 888.0 | 48.485 |
| 887.0 | 46.809 |
| 886.0 | 45.411 |
| 885.0 | 44.351 |
| 884.0 | 43.448 |
| 883.0 | 42.852 |
| 882.0 | 42.45 |
| 881.0 | 42.331 |
| 880.0 | 42.379 |
| 879.0 | 42.739 |
| 878.0 | 43.37 |
| 877.0 | 44.222 |
| 876.0 | 45.407 |
| 875.0 | 46.869 |
| 874.0 | 48.736 |
| 873.0 | 50.845 |
| 872.0 | 53.225 |
| 871.0 | 56.011 |
| 870.0 | 59.181 |
| 869.0 | 62.676 |
| 868.0 | 66.479 |
| 867.0 | 70.585 |
| 866.0 | 74.398 |
| 865.0 | 78.201 |
| 864.0 | 81.629 |
| 863.0 | 84.474 |
| 862.0 | 86.487 |
| 861.0 | 87.466 |
| 860.0 | 86.951 |
| 859.0 | 85.455 |
| 858.0 | 82.777 |
| 857.0 | 79.248 |
| 856.0 | 75.105 |
| 855.0 | 70.565 |
| 854.0 | 65.936 |
| 853.0 | 61.394 |
| 852.0 | 57.221 |
| 851.0 | 53.388 |
| 850.0 | 49.908 |
| 849.0 | 46.728 |
| 848.0 | 43.981 |
| 847.0 | 41.667 |
| 846.0 | 39.682 |
| 845.0 | 37.998 |
| 844.0 | 36.659 |
| 843.0 | 35.652 |
| 842.0 | 34.929 |
| 841.0 | 34.538 |
| 840.0 | 34.457 |
| 839.0 | 34.708 |
| 838.0 | 35.302 |
| 837.0 | 36.286 |
| 836.0 | 37.632 |
| 835.0 | 39.407 |
| 834.0 | 41.462 |
| 833.0 | 43.992 |
| 832.0 | 47.004 |
| 831.0 | 50.345 |
| 830.0 | 54.215 |
| 829.0 | 58.391 |
| 828.0 | 62.583 |
| 827.0 | 66.886 |
| 826.0 | 70.84 |
| 825.0 | 74.323 |
| 824.0 | 76.705 |
| 823.0 | 77.875 |
| 822.0 | 77.62 |
| 821.0 | 75.854 |
| 820.0 | 72.739 |
| 819.0 | 69.077 |
| 818.0 | 64.756 |
| 817.0 | 60.021 |
| 816.0 | 55.301 |
| 815.0 | 50.86 |
| 814.0 | 46.878 |
| 813.0 | 43.166 |
| 812.0 | 40.004 |
| 811.0 | 37.194 |
| 810.0 | 34.814 |
| 809.0 | 32.917 |
| 808.0 | 31.402 |
| 807.0 | 30.326 |
| 806.0 | 29.688 |
| 805.0 | 29.462 |
| 804.0 | 29.708 |
| 803.0 | 30.322 |
| 802.0 | 31.255 |
| 801.0 | 32.592 |
| 800.0 | 34.218 |
| 799.0 | 29.448 |
| 798.0 | 32.481 |
| 797.0 | 36.407 |
| 796.0 | 41.592 |
| 795.0 | 48.168 |
| 794.0 | 56.195 |
| 793.0 | 65.492 |
| 792.0 | 75.087 |
| 791.0 | 82.715 |
| 790.0 | 85.865 |
| 789.0 | 83.012 |
| 788.0 | 74.941 |
| 787.0 | 64.178 |
| 786.0 | 53.172 |
| 785.0 | 43.715 |
| 784.0 | 35.909 |
| 783.0 | 29.772 |
| 782.0 | 25.124 |
| 781.0 | 21.611 |
| 780.0 | 18.987 |
| 779.0 | 17.033 |
| 778.0 | 15.579 |
| 777.0 | 14.541 |
| 776.0 | 13.824 |
| 775.0 | 13.409 |
| 774.0 | 13.282 |
| 773.0 | 13.466 |
| 772.0 | 13.98 |
| 771.0 | 14.875 |
| 770.0 | 16.228 |
| 769.0 | 18.257 |
| 768.0 | 21.268 |
| 767.0 | 25.659 |
| 766.0 | 32.139 |
| 765.0 | 41.553 |
| 764.0 | 54.493 |
| 763.0 | 69.154 |
| 762.0 | 78.899 |
| 761.0 | 77.17 |
| 760.0 | 64.346 |
| 759.0 | 47.93 |
| 758.0 | 34.128 |
| 757.0 | 24.546 |
| 756.0 | 18.172 |
| 755.0 | 14.018 |
| 754.0 | 11.257 |
| 753.0 | 9.362 |
| 752.0 | 8.072 |
| 751.0 | 7.201 |
| 750.0 | 6.642 |
| 749.0 | 6.328 |
| 748.0 | 6.228 |
| 747.0 | 6.357 |
| 746.0 | 6.749 |
| 745.0 | 7.519 |
| 744.0 | 8.822 |
| 743.0 | 11.117 |
| 742.0 | 15.263 |
| 741.0 | 23.407 |
| 740.0 | 39.031 |
| 739.0 | 58.263 |
| 738.0 | 64.272 |
| 737.0 | 48.591 |
| 736.0 | 27.651 |
| 735.0 | 14.614 |
| 734.0 | 8.438 |
| 733.0 | 5.412 |
| 732.0 | 3.795 |
| 731.0 | 2.869 |
| 730.0 | 2.299 |
| 729.0 | 1.945 |
| 728.0 | 1.734 |
| 727.0 | 1.629 |
| 726.0 | 1.618 |
| 725.0 | 1.72 |
| 724.0 | 1.985 |
| 723.0 | 2.578 |
| 722.0 | 4.03 |
| 721.0 | 6.704 |
| 720.0 | 23.533 |
| 719.0 | 33.045 |
| 718.0 | 22.326 |
| 717.0 | 7.586 |
| 716.0 | 2.22 |
| 715.0 | 0.959 |
| 714.0 | 0.53 |
| 713.0 | 0.339 |
| 712.0 | 0.238 |
| 711.0 | 0.18 |
| 710.0 | 0.147 |
| 709.0 | 0.13 |
| 708.0 | 0.125 |
| 707.0 | 0.135 |
| 706.0 | 0.179 |
| 705.0 | 0.514 |
| 704.0 | 2.602 |
| 703.0 | 4.413 |
| 702.0 | 2.675 |
| 701.0 | 0.471 |
| 700.0 | 0.051 |
| 699.0 | 0.015 |
| 698.0 | 0.006 |
| 697.0 | 0.003 |
| 696.0 | 0.002 |
| 695.0 | 0.001 |
| 694.0 | 0.001 |
| 693.0 | 0 |
| 692.0 | 0 |
| 691.0 | 0 |
| 690.0 | 0 |
| 689.0 | 0 |
| 688.0 | 0 |
| 687.0 | 0 |
| 686.0 | 0 |
| 685.0 | 0 |
| 684.0 | 0 |
| 683.0 | 0 |
| 682.0 | 0 |
| 681.0 | 0 |
| 680.0 | 0 |
| 679.0 | 0 |
| 678.0 | 0 |
| 677.0 | 0 |
| 676.0 | 0 |
| 675.0 | 0 |
| 674.0 | 0 |
| 673.0 | 0 |
| 672.0 | 0 |
| 671.0 | 0 |
| 670.0 | 0 |
| 669.0 | 0 |
| 668.0 | 0 |
| 667.0 | 0 |
| 666.0 | 0 |
| 665.0 | 0 |
| 664.0 | 0 |
| 663.0 | 0 |
| 662.0 | 0 |
| 661.0 | 0 |
| 660.0 | 0 |
| 659.0 | 0 |
| 658.0 | 0 |
| 657.0 | 0 |
| 656.0 | 0 |
| 655.0 | 0 |
| 654.0 | 0 |
| 653.0 | 0 |
| 652.0 | 0 |
| 651.0 | 0 |
| 650.0 | 0 |
| 649.0 | 0 |
| 648.0 | 0 |
| 647.0 | 0 |
| 646.0 | 0 |
| 645.0 | 0 |
| 644.0 | 0 |
| 643.0 | 0 |
| 642.0 | 0 |
| 641.0 | 0 |
| 640.0 | 0 |
| 639.0 | 0 |
| 638.0 | 0 |
| 637.0 | 0 |
| 636.0 | 0 |
| 635.0 | 0 |
| 634.0 | 0 |
| 633.0 | 0 |
| 632.0 | 0 |
| 631.0 | 0 |
| 630.0 | 0 |
| 629.0 | 0 |
| 628.0 | 0 |
| 627.0 | 0 |
| 626.0 | 0 |
| 625.0 | 0 |
| 624.0 | 0 |
| 623.0 | 0 |
| 622.0 | 0 |
| 621.0 | 0 |
| 620.0 | 0 |
| 619.0 | 0 |
| 618.0 | 0 |
| 617.0 | 0 |
| 616.0 | 0 |
| 615.0 | 0 |
| 614.0 | 0 |
| 613.0 | 0 |
| 612.0 | 0 |
| 611.0 | 0 |
| 610.0 | 0 |
| 609.0 | 0 |
| 608.0 | 0 |
| 607.0 | 0 |
| 606.0 | 0 |
| 605.0 | 0 |
| 604.0 | 0 |
| 603.0 | 0 |
| 602.0 | 0 |
| 601.0 | 0 |
| 600.0 | 0 |
| 599.0 | 0 |
| 598.0 | 0 |
| 597.0 | 0 |
| 596.0 | 0 |
| 595.0 | 0 |
| 594.0 | 0 |
| 593.0 | 0 |
| 592.0 | 0 |
| 591.0 | 0 |
| 590.0 | 0 |
| 589.0 | 0 |
| 588.0 | 0 |
| 587.0 | 0 |
| 586.0 | 0 |
| 585.0 | 0 |
| 584.0 | 0 |
| 583.0 | 0 |
| 582.0 | 0 |
| 581.0 | 0 |
| 580.0 | 0 |
| 579.0 | 0 |
| 578.0 | 0 |
| 577.0 | 0 |
| 576.0 | 0 |
| 575.0 | 0 |
| 574.0 | 0 |
| 573.0 | 0 |
| 572.0 | 0 |
| 571.0 | 0 |
| 570.0 | 0 |
| 569.0 | 0 |
| 568.0 | 0 |
| 567.0 | 0 |
| 566.0 | 0 |
| 565.0 | 0 |
| 564.0 | 0 |
| 563.0 | 0 |
| 562.0 | 0 |
| 561.0 | 0 |
| 560.0 | 0 |
| 559.0 | 0 |
| 558.0 | 0 |
| 557.0 | 0 |
| 556.0 | 0 |
| 555.0 | 0 |
| 554.0 | 0 |
| 553.0 | 0 |
| 552.0 | 0 |
| 551.0 | 0 |
| 550.0 | 0 |
| 549.0 | 0 |
| 548.0 | 0 |
| 547.0 | 0 |
| 546.0 | 0 |
| 545.0 | 0 |
| 544.0 | 0 |
| 543.0 | 0 |
| 542.0 | 0 |
| 541.0 | 0 |
| 540.0 | 0 |
| 539.0 | 0 |
| 538.0 | 0 |
| 537.0 | 0 |
| 536.0 | 0 |
| 535.0 | 0 |
| 534.0 | 0 |
| 533.0 | 0 |
| 532.0 | 0 |
| 531.0 | 0 |
| 530.0 | 0 |
| 529.0 | 0 |
| 528.0 | 0 |
| 527.0 | 0.001 |
| 526.0 | 0.001 |
| 525.0 | 0.001 |
| 524.0 | 0.001 |
| 523.0 | 0.001 |
| 522.0 | 0.001 |
| 521.0 | 0.001 |
| 520.0 | 0.001 |
| 519.0 | 0.001 |
| 518.0 | 0.002 |
| 517.0 | 0.002 |
| 516.0 | 0.002 |
| 515.0 | 0.002 |
| 514.0 | 0.003 |
| 513.0 | 0.004 |
| 512.0 | 0.005 |
| 511.0 | 0.007 |
| 510.0 | 0.009 |
| 509.0 | 0.014 |
| 508.0 | 0.024 |
| 507.0 | 0.043 |
| 506.0 | 0.084 |
| 505.0 | 0.182 |
| 504.0 | 0.435 |
| 503.0 | 1.132 |
| 502.0 | 3.232 |
| 501.0 | 6.473 |
| 500.0 | 22.431 |
| 499.0 | 41.638 |
| 498.0 | 58.624 |
| 497.0 | 67.916 |
| 496.0 | 71.481 |
| 495.0 | 73.179 |
| 494.0 | 74.492 |
| 493.0 | 75.589 |
| 492.0 | 76.379 |
| 491.0 | 76.894 |
| 490.0 | 77.255 |
| 489.0 | 77.5 |
| 488.0 | 77.698 |
| 487.0 | 77.909 |
| 486.0 | 78.168 |
| 485.0 | 78.493 |
| 484.0 | 78.761 |
| 483.0 | 78.997 |
| 482.0 | 79.185 |
| 481.0 | 79.217 |
| 480.0 | 79.207 |
| 479.0 | 79.277 |
| 478.0 | 79.352 |
| 477.0 | 79.522 |
| 476.0 | 79.749 |
| 475.0 | 79.97 |
| 474.0 | 80.1 |
| 473.0 | 80.171 |
| 472.0 | 80.162 |
| 471.0 | 80.12 |
| 470.0 | 80.132 |
| 469.0 | 80.174 |
| 468.0 | 80.317 |
| 467.0 | 80.43 |
| 466.0 | 80.485 |
| 465.0 | 80.467 |
| 464.0 | 80.32 |
| 463.0 | 80.158 |
| 462.0 | 80.07 |
| 461.0 | 80.008 |
| 460.0 | 80.067 |
| 459.0 | 80.21 |
| 458.0 | 80.391 |
| 457.0 | 80.469 |
| 456.0 | 80.35 |
| 455.0 | 80.033 |
| 454.0 | 79.656 |
| 453.0 | 79.321 |
| 452.0 | 79.107 |
| 451.0 | 79.145 |
| 450.0 | 79.347 |
| 449.0 | 79.638 |
| 448.0 | 79.91 |
| 447.0 | 79.961 |
| 446.0 | 79.816 |
| 445.0 | 79.459 |
| 444.0 | 78.993 |
| 443.0 | 78.657 |
| 442.0 | 78.577 |
| 441.0 | 78.696 |
| 440.0 | 78.976 |
| 439.0 | 79.197 |
| 438.0 | 79.259 |
| 437.0 | 79.062 |
| 436.0 | 78.622 |
| 435.0 | 78.167 |
| 434.0 | 77.763 |
| 433.0 | 77.557 |
| 432.0 | 77.562 |
| 431.0 | 77.703 |
| 430.0 | 77.74 |
| 429.0 | 77.6 |
| 428.0 | 77.162 |
| 427.0 | 76.594 |
| 426.0 | 75.958 |
| 425.0 | 75.543 |
| 424.0 | 75.342 |
| 423.0 | 75.323 |
| 422.0 | 75.335 |
| 421.0 | 75.188 |
| 420.0 | 74.832 |
| 419.0 | 74.22 |
| 418.0 | 73.493 |
| 417.0 | 72.781 |
| 416.0 | 72.236 |
| 415.0 | 71.748 |
| 414.0 | 71.452 |
| 413.0 | 71.023 |
| 412.0 | 70.395 |
| 411.0 | 69.616 |
| 410.0 | 68.657 |
| 409.0 | 67.469 |
| 408.0 | 66.277 |
| 407.0 | 65.022 |
| 406.0 | 63.83 |
| 405.0 | 62.711 |
| 404.0 | 61.639 |
| 403.0 | 60.561 |
| 402.0 | 59.315 |
| 401.0 | 57.777 |
| 400.0 | 55.979 |
| 399.0 | 54.179 |
| 398.0 | 52.608 |
| 397.0 | 51.219 |
| 396.0 | 49.753 |
| 395.0 | 47.876 |
| 394.0 | 45.347 |
| 393.0 | 42.422 |
| 392.0 | 39.617 |
| 391.0 | 37.29 |
| 390.0 | 35.437 |
| 389.0 | 33.574 |
| 388.0 | 31.255 |
| 387.0 | 28.454 |
| 386.0 | 25.559 |
| 385.0 | 23.083 |
| 384.0 | 20.998 |
| 383.0 | 19.096 |
| 382.0 | 17.015 |
| 381.0 | 14.68 |
| 380.0 | 12.394 |
| 379.0 | 10.417 |
| 378.0 | 8.74 |
| 377.0 | 7.266 |
| 376.0 | 5.885 |
| 375.0 | 4.638 |
| 374.0 | 3.602 |
| 373.0 | 2.784 |
| 372.0 | 2.136 |
| 371.0 | 1.602 |
| 370.0 | 1.163 |
| 369.0 | 0.828 |
| 368.0 | 0.577 |
| 367.0 | 0.395 |
| 366.0 | 0.265 |
| 365.0 | 0.173 |
| 364.0 | 0.111 |
| 363.0 | 0.069 |
| 362.0 | 0.042 |
| 361.0 | 0.025 |
| 360.0 | 0.015 |
| 359.0 | 0.009 |
| 358.0 | 0.005 |
| 357.0 | 0.003 |
| 356.0 | 0.002 |
| 355.0 | 0.001 |
| 354.0 | 0.001 |
| 353.0 | 0 |
| 352.0 | 0 |
| 351.0 | 0 |
| 350.0 | 0 |
| 349.0 | 0 |
| 348.0 | 0 |
| 347.0 | 0 |
| 346.0 | 0 |
| 345.0 | 0 |
| 344.0 | 0 |
| 343.0 | 0 |
| 342.0 | 0 |
| 341.0 | 0 |
| 340.0 | 0 |
| 339.0 | 0 |
| 338.0 | 0 |
| 337.0 | 0 |
| 336.0 | 0 |
| 335.0 | 0 |
| 334.0 | 0 |
| 333.0 | 0 |
| 332.0 | 0 |
| 331.0 | 0 |
| 330.0 | 0 |
| 329.0 | 0 |
| 328.0 | 0 |
| 327.0 | 0 |
| 326.0 | 0 |
| 325.0 | 0 |
| 324.0 | 0 |
| 323.0 | 0 |
| 322.0 | 0 |
| 321.0 | 0 |
| 320.0 | 0 |
| 319.0 | 0 |
| 318.0 | 0 |
| 317.0 | 0 |
| 316.0 | 0 |
| 315.0 | 0 |
| 314.0 | 0 |
| 313.0 | 0 |
| 312.0 | 0.001 |
| 311.0 | 0.001 |
| 310.0 | 0.001 |
| 309.0 | 0.001 |
| 308.0 | 0.001 |
| 307.0 | 0.001 |
| 306.0 | 0.001 |
| 305.0 | 0.001 |
| 304.0 | 0.001 |
| 303.0 | 0.001 |
| 302.0 | 0.001 |
| 301.0 | 0.001 |
| 300.0 | 0.001 |
| 299.0 | 0.001 |
| 298.0 | 0.001 |
| 297.0 | 0.001 |
| 296.0 | 0.001 |
| 295.0 | 0.002 |
| 294.0 | 0.002 |
| 293.0 | 0.002 |
| 292.0 | 0.002 |
| 291.0 | 0.002 |
| 290.0 | 0.002 |
| 289.0 | 0.002 |
| 288.0 | 0.002 |
| 287.0 | 0.002 |
| 286.0 | 0.002 |
| 285.0 | 0.002 |
| 284.0 | 0.002 |
| 283.0 | 0.002 |
| 282.0 | 0.002 |
| 281.0 | 0.002 |
| 280.0 | 0.002 |
| 279.0 | 0.002 |
| 278.0 | 0.002 |
| 277.0 | 0.002 |
| 276.0 | 0.002 |
| 275.0 | 0.002 |
| 274.0 | 0.002 |
| 273.0 | 0.002 |
| 272.0 | 0.002 |
| 271.0 | 0.002 |
| 270.0 | 0.002 |
| 269.0 | 0.002 |
| 268.0 | 0.002 |
| 267.0 | 0.002 |
| 266.0 | 0.002 |
| 265.0 | 0.002 |
| 264.0 | 0.002 |
| 263.0 | 0.002 |
| 262.0 | 0.002 |
| 261.0 | 0.002 |
| 260.0 | 0.002 |
| 259.0 | 0.002 |
| 258.0 | 0.002 |
| 257.0 | 0.002 |
| 256.0 | 0.002 |
| 255.0 | 0.002 |
| 254.0 | 0.002 |
| 253.0 | 0.002 |
| 252.0 | 0.002 |
| 251.0 | 0.002 |
| 250.0 | 0.002 |
| 249.0 | 0.002 |
| 248.0 | 0.002 |
| 247.0 | 0.002 |
| 246.0 | 0.002 |
| 245.0 | 0.002 |
| 244.0 | 0.003 |
| 243.0 | 0.003 |
| 242.0 | 0.003 |
| 241.0 | 0.003 |
| 240.0 | 0.003 |
| 239.0 | 0.003 |
| 238.0 | 0.003 |
| 237.0 | 0.003 |
| 236.0 | 0.003 |
| 235.0 | 0.003 |
| 234.0 | 0.003 |
| 233.0 | 0.003 |
| 232.0 | 0.003 |
| 231.0 | 0.003 |
| 230.0 | 0.003 |
| 229.0 | 0.003 |
| 228.0 | 0.003 |
| 227.0 | 0.003 |
| 226.0 | 0.003 |
| 225.0 | 0.003 |
| 224.0 | 0.003 |
| 223.0 | 0.003 |
| 222.0 | 0.003 |
| 221.0 | 0.003 |
| 220.0 | 0.003 |
| 219.0 | 0.003 |
| 218.0 | 0.003 |
| 217.0 | 0.003 |
| 216.0 | 0.003 |
| 215.0 | 0.003 |
| 214.0 | 0.003 |
| 213.0 | 0.003 |
| 212.0 | 0.003 |
| 211.0 | 0.003 |
| 210.0 | 0.003 |
| 209.0 | 0.003 |
| 208.0 | 0.003 |
| 207.0 | 0.003 |
| 206.0 | 0.003 |
| 205.0 | 0.003 |
| 204.0 | 0.003 |
| 203.0 | 0.004 |
| 202.0 | 0.004 |
| 201.0 | 0.004 |